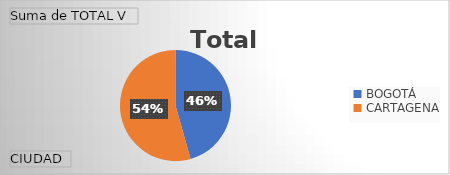
| Category | Total |
|---|---|
| BOGOTÁ | 36235.5 |
| CARTAGENA | 43197 |